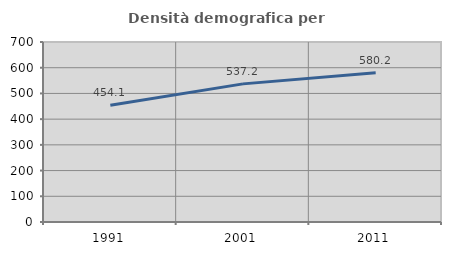
| Category | Densità demografica |
|---|---|
| 1991.0 | 454.098 |
| 2001.0 | 537.17 |
| 2011.0 | 580.161 |